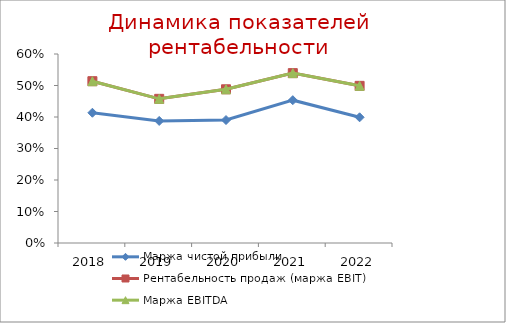
| Category | Маржа чистой прибыли | Рентабельность продаж (маржа EBIT) | Маржа EBITDA |
|---|---|---|---|
| 2018.0 | 0.413 | 0.514 | 0.514 |
| 2019.0 | 0.387 | 0.458 | 0.458 |
| 2020.0 | 0.39 | 0.488 | 0.488 |
| 2021.0 | 0.453 | 0.539 | 0.539 |
| 2022.0 | 0.399 | 0.499 | 0.499 |